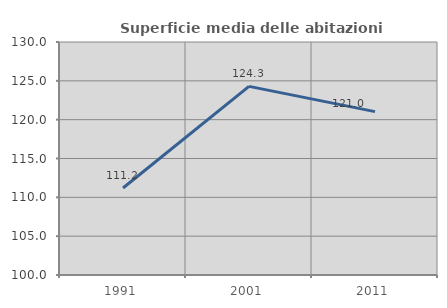
| Category | Superficie media delle abitazioni occupate |
|---|---|
| 1991.0 | 111.204 |
| 2001.0 | 124.287 |
| 2011.0 | 121.033 |